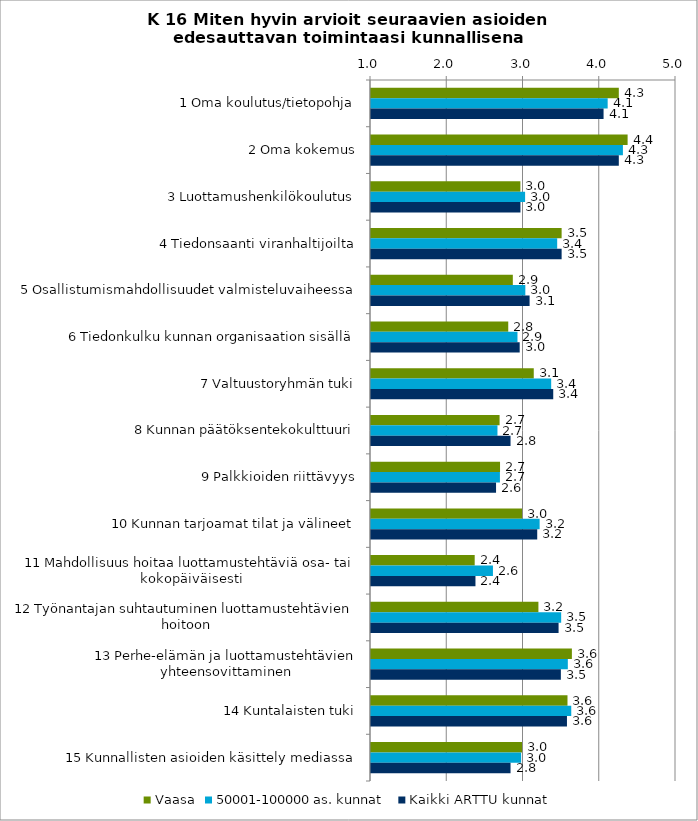
| Category | Vaasa | 50001-100000 as. kunnat | Kaikki ARTTU kunnat |
|---|---|---|---|
| 1 Oma koulutus/tietopohja | 4.25 | 4.104 | 4.05 |
| 2 Oma kokemus | 4.365 | 4.304 | 4.25 |
| 3 Luottamushenkilökoulutus | 2.959 | 3.021 | 2.96 |
| 4 Tiedonsaanti viranhaltijoilta | 3.5 | 3.442 | 3.5 |
| 5 Osallistumismahdollisuudet valmisteluvaiheessa | 2.86 | 3.024 | 3.08 |
| 6 Tiedonkulku kunnan organisaation sisällä | 2.8 | 2.921 | 2.95 |
| 7 Valtuustoryhmän tuki | 3.135 | 3.363 | 3.39 |
| 8 Kunnan päätöksentekokulttuuri | 2.686 | 2.659 | 2.83 |
| 9 Palkkioiden riittävyys | 2.692 | 2.691 | 2.64 |
| 10 Kunnan tarjoamat tilat ja välineet | 2.981 | 3.212 | 3.18 |
| 11 Mahdollisuus hoitaa luottamustehtäviä osa- tai kokopäiväisesti | 2.36 | 2.599 | 2.37 |
| 12 Työnantajan suhtautuminen luottamustehtävien hoitoon | 3.196 | 3.494 | 3.46 |
| 13 Perhe-elämän ja luottamustehtävien yhteensovittaminen | 3.635 | 3.581 | 3.49 |
| 14 Kuntalaisten tuki | 3.577 | 3.626 | 3.57 |
| 15 Kunnallisten asioiden käsittely mediassa | 2.981 | 2.969 | 2.83 |